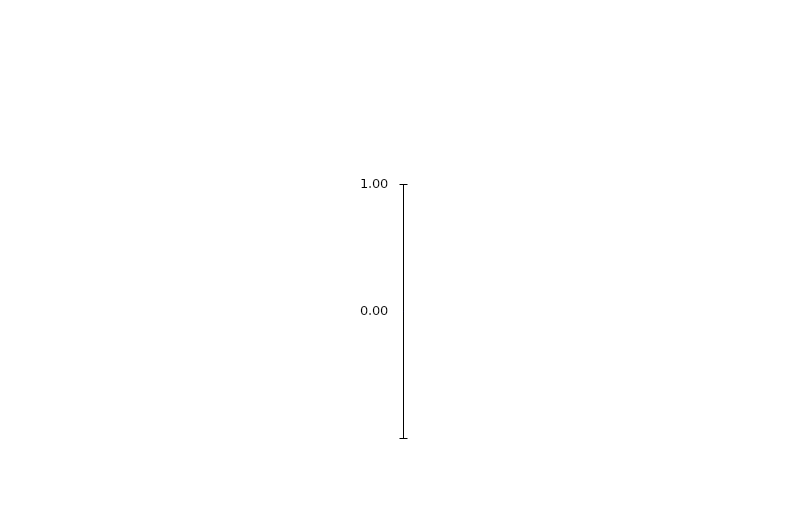
| Category | Valeurs des incateurs | Valeurs moyennes des indicateurs | max |
|---|---|---|---|
|  | 0 |  |  |
|  | 0 |  |  |